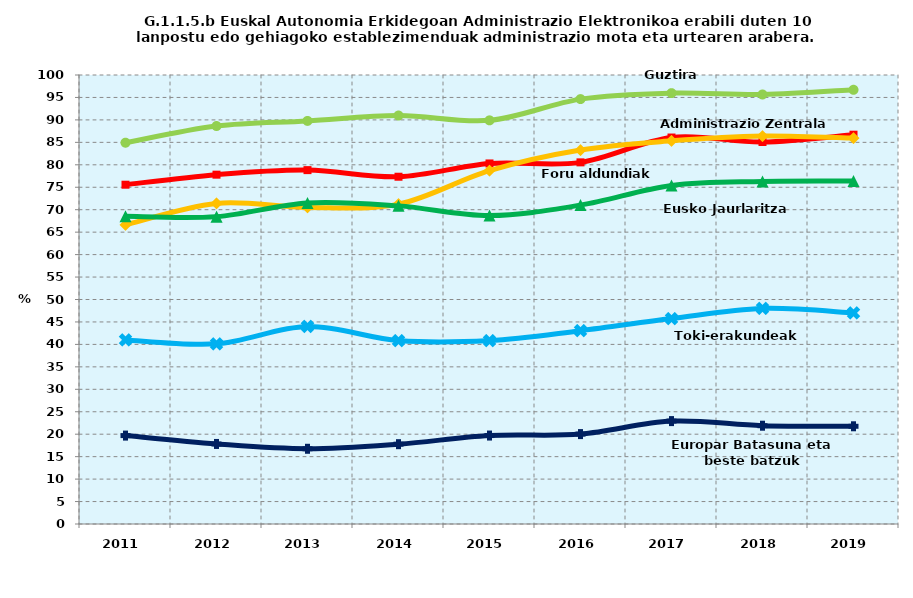
| Category | Guztira | Foru aldundiak | Administrazio Zentrala | Eusko Jaurlaritza | Toki-erakundeak | Europar Batasuna eta beste batzuk |
|---|---|---|---|---|---|---|
| 2011.0 | 84.919 | 75.566 | 66.635 | 68.518 | 40.99 | 19.69 |
| 2012.0 | 88.639 | 77.803 | 71.399 | 68.457 | 40.12 | 17.825 |
| 2013.0 | 89.774 | 78.814 | 70.5 | 71.513 | 43.99 | 16.752 |
| 2014.0 | 90.972 | 77.343 | 71.245 | 70.852 | 40.845 | 17.779 |
| 2015.0 | 89.9 | 80.3 | 78.7 | 68.7 | 40.845 | 19.7 |
| 2016.0 | 94.63 | 80.543 | 83.285 | 71.025 | 43.062 | 20.023 |
| 2017.0 | 95.964 | 86.074 | 85.341 | 75.396 | 45.758 | 22.918 |
| 2018.0 | 95.655 | 85.076 | 86.41 | 76.28 | 48.003 | 21.89 |
| 2019.0 | 96.71 | 86.706 | 85.942 | 76.372 | 47.022 | 21.763 |